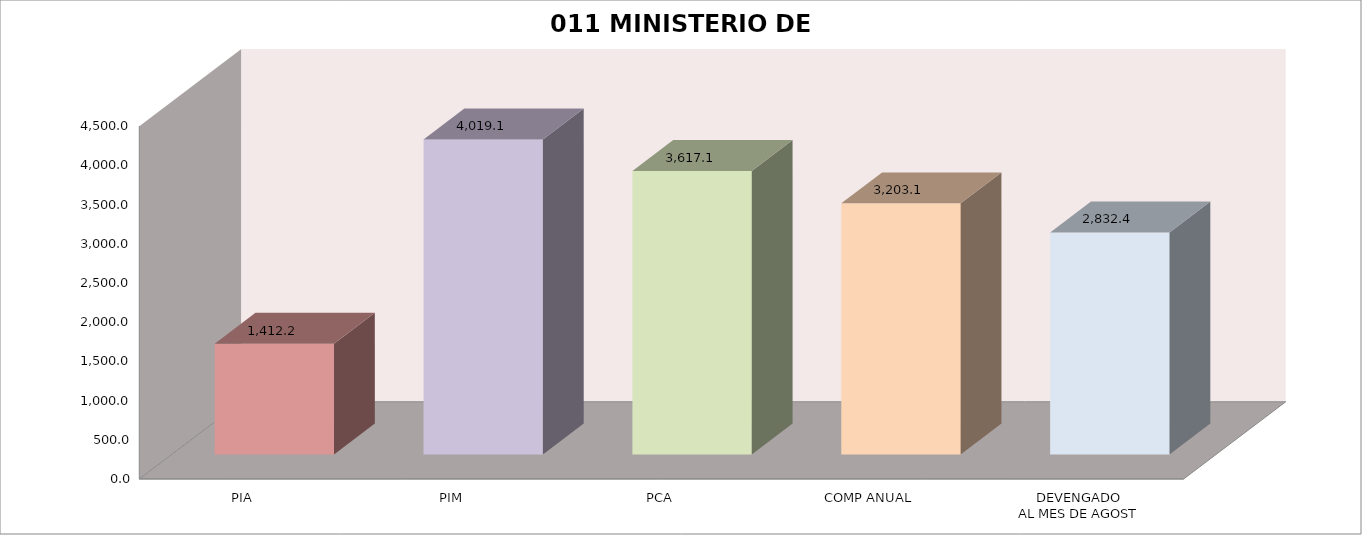
| Category | 011 MINISTERIO DE SALUD |
|---|---|
| PIA | 1412.218 |
| PIM | 4019.056 |
| PCA | 3617.15 |
| COMP ANUAL | 3203.093 |
| DEVENGADO
AL MES DE AGOST | 2832.403 |